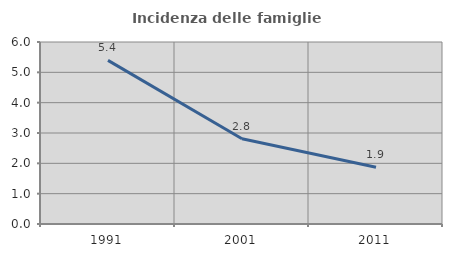
| Category | Incidenza delle famiglie numerose |
|---|---|
| 1991.0 | 5.395 |
| 2001.0 | 2.81 |
| 2011.0 | 1.868 |